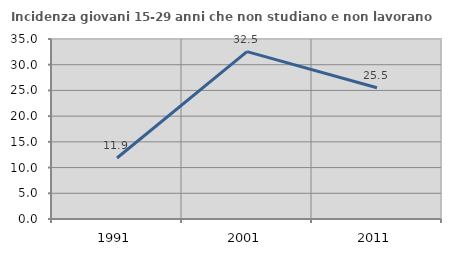
| Category | Incidenza giovani 15-29 anni che non studiano e non lavorano  |
|---|---|
| 1991.0 | 11.864 |
| 2001.0 | 32.54 |
| 2011.0 | 25.508 |